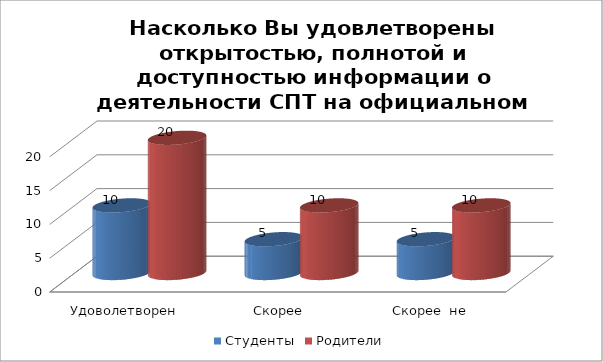
| Category | Студенты | Родители |
|---|---|---|
| Удоволетворен | 10 | 20 |
| Скорее удовлетворен | 5 | 10 |
| Скорее  не удовлетворен | 5 | 10 |